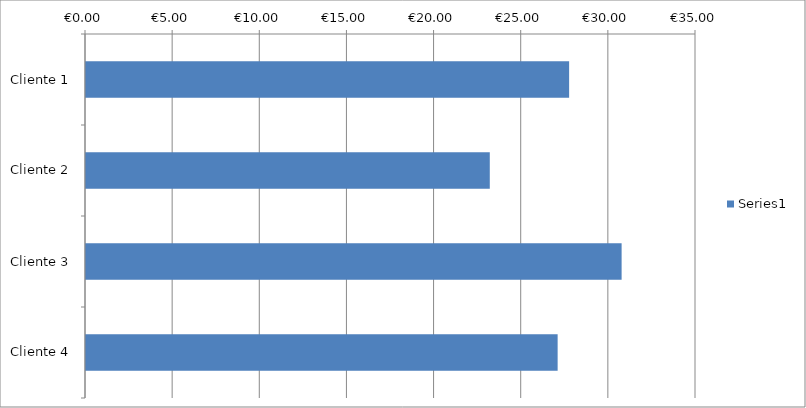
| Category | Series 0 |
|---|---|
| Cliente 1 | 27.778 |
| Cliente 2 | 23.226 |
| Cliente 3 | 30.789 |
| Cliente 4 | 27.119 |